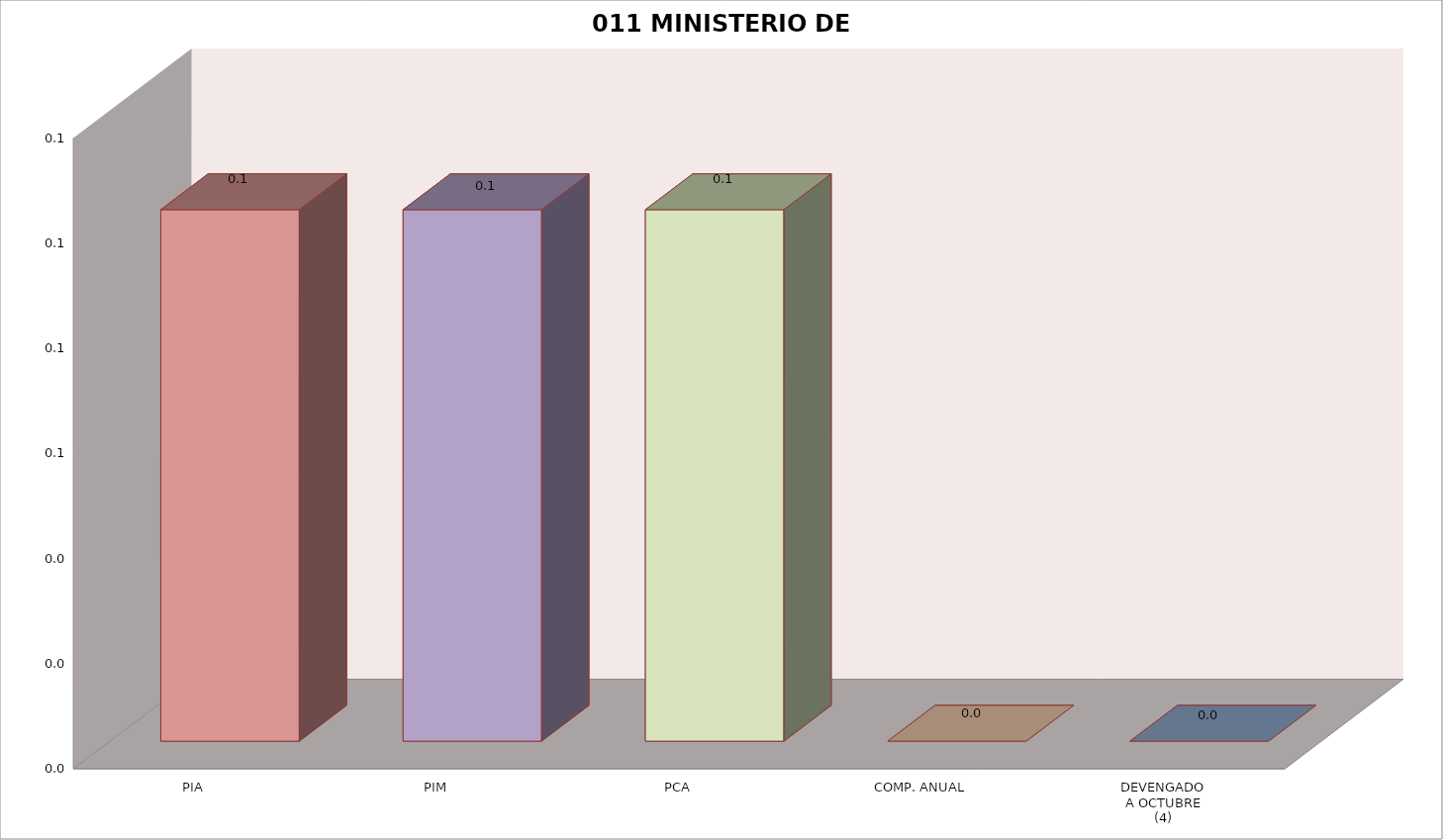
| Category | 011 MINISTERIO DE SALUD |
|---|---|
| PIA | 0.101 |
| PIM | 0.101 |
| PCA | 0.101 |
| COMP. ANUAL | 0 |
| DEVENGADO
A OCTUBRE
(4) | 0 |